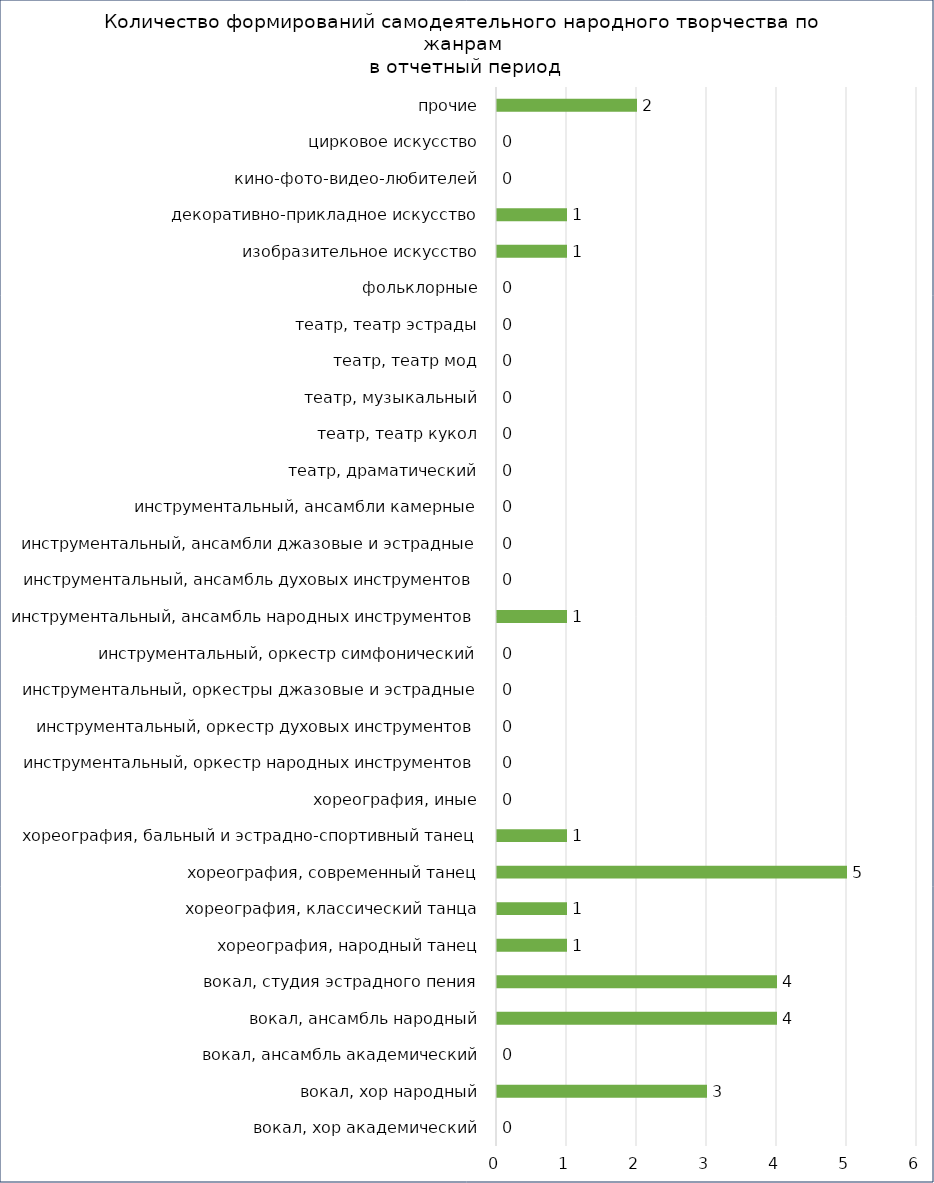
| Category | Количество коллективов по жанрам |
|---|---|
| вокал, хор академический | 0 |
| вокал, хор народный | 3 |
| вокал, ансамбль академический | 0 |
| вокал, ансамбль народный | 4 |
| вокал, студия эстрадного пения | 4 |
| хореография, народный танец | 1 |
| хореография, классический танца | 1 |
| хореография, современный танец | 5 |
| хореография, бальный и эстрадно-спортивный танец | 1 |
| хореография, иные | 0 |
| инструментальный, оркестр народных инструментов | 0 |
| инструментальный, оркестр духовых инструментов | 0 |
| инструментальный, оркестры джазовые и эстрадные | 0 |
| инструментальный, оркестр симфонический | 0 |
| инструментальный, ансамбль народных инструментов | 1 |
| инструментальный, ансамбль духовых инструментов | 0 |
| инструментальный, ансамбли джазовые и эстрадные | 0 |
| инструментальный, ансамбли камерные | 0 |
| театр, драматический | 0 |
| театр, театр кукол | 0 |
| театр, музыкальный | 0 |
| театр, театр мод | 0 |
| театр, театр эстрады | 0 |
| фольклорные | 0 |
| изобразительное искусство | 1 |
| декоративно-прикладное искусство | 1 |
| кино-фото-видео-любителей | 0 |
| цирковое искусство | 0 |
| прочие | 2 |